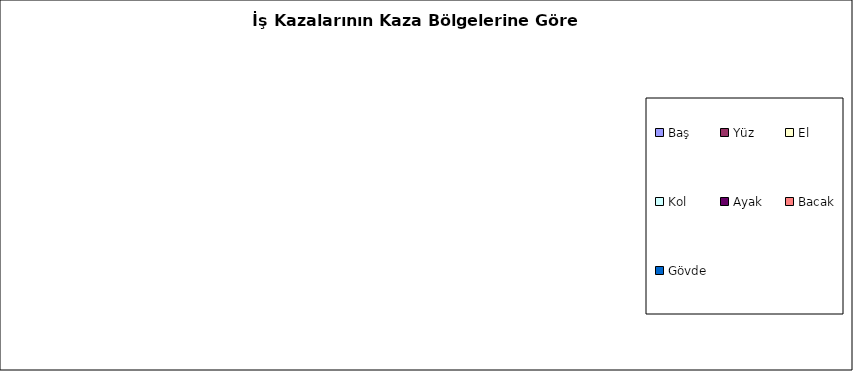
| Category | Series 0 |
|---|---|
| Baş | 0 |
| Yüz | 0 |
| El | 0 |
| Kol | 0 |
| Ayak | 0 |
| Bacak | 0 |
| Gövde | 0 |